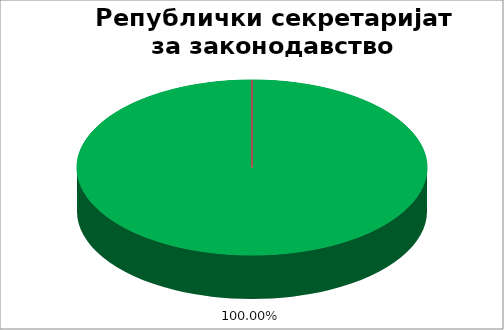
| Category | Републички секретаријат за законодавство |
|---|---|
| 0 | 1 |
| 1 | 0 |
| 2 | 0 |
| 3 | 0 |
| 4 | 0 |